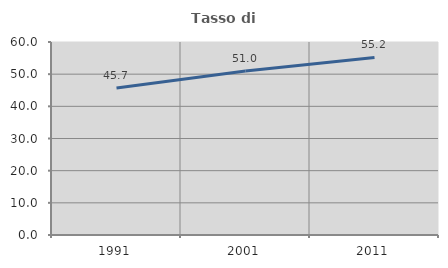
| Category | Tasso di occupazione   |
|---|---|
| 1991.0 | 45.676 |
| 2001.0 | 50.954 |
| 2011.0 | 55.206 |